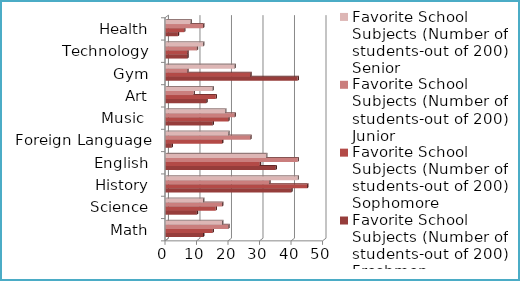
| Category | Favorite School Subjects (Number of students-out of 200) Freshmen | Favorite School Subjects (Number of students-out of 200) Sophomore | Favorite School Subjects (Number of students-out of 200) Junior | Favorite School Subjects (Number of students-out of 200) Senior |
|---|---|---|---|---|
| Math | 12 | 15 | 20 | 18 |
| Science | 10 | 16 | 18 | 12 |
| History | 40 | 45 | 33 | 42 |
| English | 35 | 30 | 42 | 32 |
| Foreign Language | 2 | 18 | 27 | 20 |
| Music  | 15 | 20 | 22 | 19 |
| Art | 13 | 16 | 9 | 15 |
| Gym | 42 | 27 | 7 | 22 |
| Technology | 7 | 7 | 10 | 12 |
| Health | 4 | 6 | 12 | 8 |